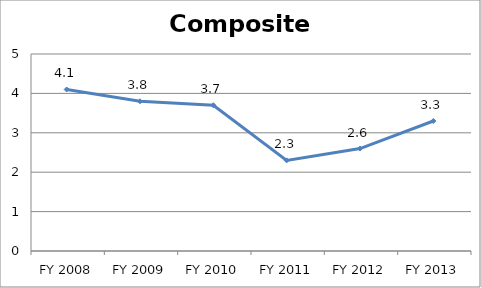
| Category | Composite score |
|---|---|
| FY 2013 | 3.3 |
| FY 2012 | 2.6 |
| FY 2011 | 2.3 |
| FY 2010 | 3.7 |
| FY 2009 | 3.8 |
| FY 2008 | 4.1 |